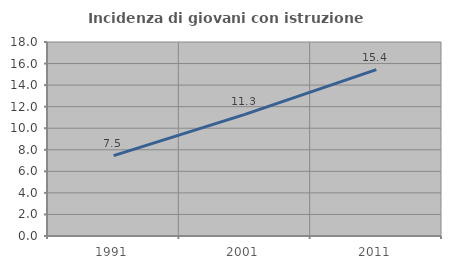
| Category | Incidenza di giovani con istruzione universitaria |
|---|---|
| 1991.0 | 7.463 |
| 2001.0 | 11.28 |
| 2011.0 | 15.436 |